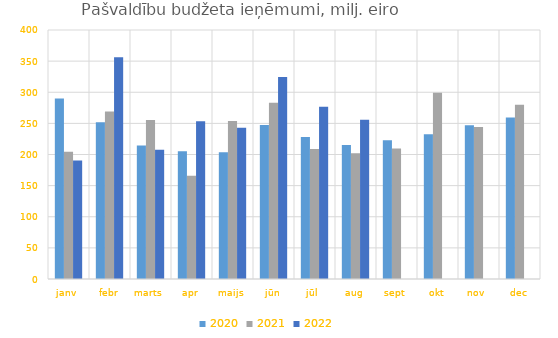
| Category | 2020 | 2021 | 2022 |
|---|---|---|---|
| janv | 290064.145 | 204517.329 | 190252.346 |
| febr | 251741.549 | 269110.565 | 356152.105 |
| marts | 214628.306 | 255479.297 | 207474.213 |
| apr | 205049 | 166036.194 | 253268.686 |
| maijs | 203771.42 | 253889.01 | 242842.454 |
| jūn | 247277.58 | 283015.617 | 324518.39 |
| jūl | 228229.354 | 209024.05 | 276611.728 |
| aug | 215329.064 | 201829.938 | 255749.732 |
| sept | 222973.772 | 209634.733 | 0 |
| okt | 232443.755 | 299380.785 | 0 |
| nov | 247188.407 | 244254.482 | 0 |
| dec | 259624.166 | 279855.963 | 0 |